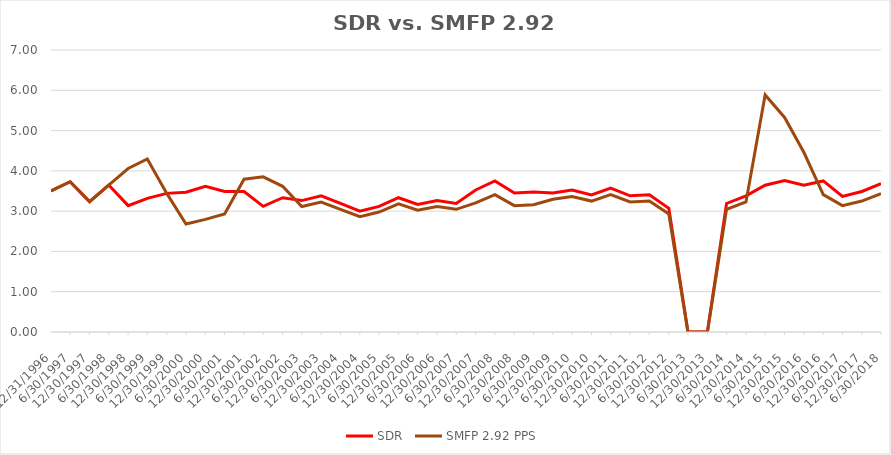
| Category | SDR | SMFP 2.92 PPS |
|---|---|---|
| 12/31/96 | 3.5 | 3.5 |
| 6/30/97 | 3.731 | 3.731 |
| 12/31/97 | 3.235 | 3.235 |
| 6/30/98 | 3.647 | 3.647 |
| 12/31/98 | 3.136 | 4.059 |
| 6/30/99 | 3.318 | 4.294 |
| 12/31/99 | 3.441 | 3.441 |
| 6/30/00 | 3.471 | 2.682 |
| 12/31/00 | 3.618 | 2.795 |
| 6/30/01 | 3.486 | 2.932 |
| 12/31/01 | 3.486 | 3.794 |
| 6/30/02 | 3.119 | 3.853 |
| 12/31/02 | 3.333 | 3.617 |
| 6/30/03 | 3.262 | 3.114 |
| 12/31/03 | 3.381 | 3.227 |
| 6/30/04 | 3.19 | 3.045 |
| 12/31/04 | 3 | 2.864 |
| 6/30/05 | 3.119 | 2.977 |
| 12/31/05 | 3.333 | 3.182 |
| 6/30/06 | 3.167 | 3.023 |
| 12/31/06 | 3.262 | 3.114 |
| 6/30/07 | 3.19 | 3.045 |
| 12/31/07 | 3.525 | 3.205 |
| 6/30/08 | 3.75 | 3.409 |
| 12/31/08 | 3.45 | 3.136 |
| 6/30/09 | 3.475 | 3.159 |
| 12/31/09 | 3.452 | 3.295 |
| 6/30/10 | 3.524 | 3.364 |
| 12/31/10 | 3.405 | 3.25 |
| 6/30/11 | 3.571 | 3.409 |
| 12/31/11 | 3.381 | 3.227 |
| 6/30/12 | 3.405 | 3.25 |
| 12/31/12 | 3.071 | 2.932 |
| 6/30/13 | 0 | 0 |
| 12/31/13 | 0 | 0 |
| 6/30/14 | 3.19 | 3.045 |
| 12/31/14 | 3.381 | 3.227 |
| 6/30/15 | 3.643 | 5.885 |
| 12/31/15 | 3.762 | 5.325 |
| 6/30/16 | 3.643 | 4.461 |
| 12/31/16 | 3.75 | 3.409 |
| 6/30/17 | 3.366 | 3.136 |
| 12/31/17 | 3.488 | 3.25 |
| 6/30/18 | 3.683 | 3.432 |